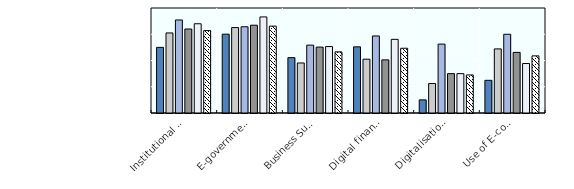
| Category | Armenia | Azerbaijan | Georgia | Moldova | Ukraine | EaP average |
|---|---|---|---|---|---|---|
| Institutional framework for SME digitalisation | 3.5 | 4.05 | 4.544 | 4.2 | 4.4 | 4.139 |
| E-government services | 4.003 | 4.254 | 4.285 | 4.345 | 4.66 | 4.309 |
| Business Support Services for the digital transformation of SMEs  | 3.109 | 2.905 | 3.585 | 3.511 | 3.531 | 3.328 |
| Digital financial services  | 3.52 | 3.05 | 3.935 | 3.024 | 3.806 | 3.467 |
| Digitalisation of Standards and Technical Regulations | 1.5 | 2.125 | 3.625 | 2.5 | 2.5 | 2.45 |
| Use of E-commerce | 2.245 | 3.442 | 4 | 3.309 | 2.885 | 3.176 |